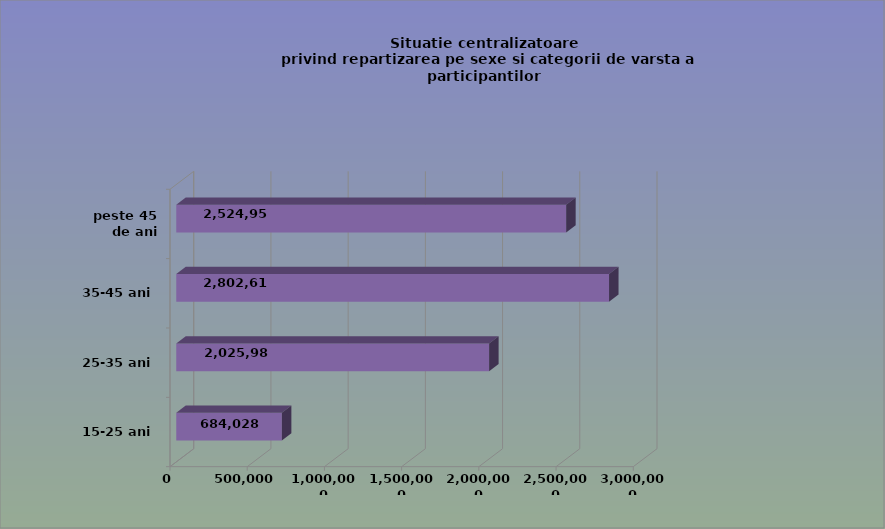
| Category | 15-25 ani 25-35 ani 35-45 ani peste 45 de ani |
|---|---|
| 15-25 ani | 684028 |
| 25-35 ani | 2025983 |
| 35-45 ani | 2802611 |
| peste 45 de ani | 2524955 |